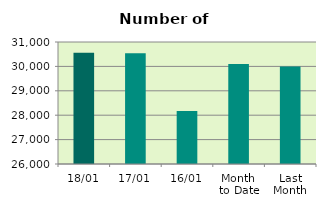
| Category | Series 0 |
|---|---|
| 18/01 | 30560 |
| 17/01 | 30540 |
| 16/01 | 28172 |
| Month 
to Date | 30102 |
| Last
Month | 29998.632 |